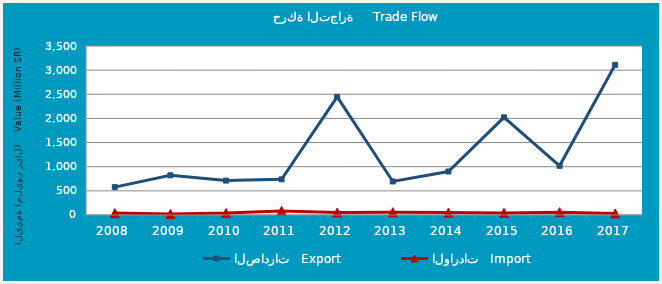
| Category | الصادرات   Export | الواردات   Import |
|---|---|---|
| 2008.0 | 577916909 | 38862538 |
| 2009.0 | 822096637 | 21218843 |
| 2010.0 | 712492312 | 40033651 |
| 2011.0 | 738257271 | 85322885 |
| 2012.0 | 2447251352 | 52013622 |
| 2013.0 | 694640404 | 57508289 |
| 2014.0 | 900991094 | 50062702 |
| 2015.0 | 2022234344 | 43954174 |
| 2016.0 | 1018622539 | 58308588 |
| 2017.0 | 3110561764 | 33271545 |